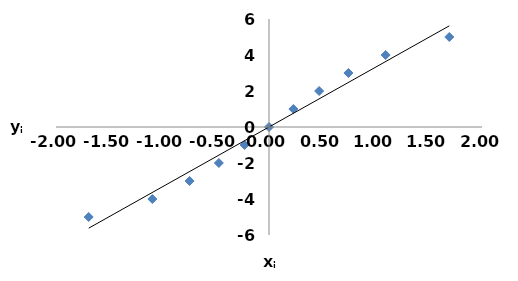
| Category | yi |
|---|---|
| -1.692884905001657 | -5 |
| -1.095418933048971 | -4 |
| -0.7456970866736052 | -3 |
| -0.4709712362120345 | -2 |
| -0.22888335892891973 | -1 |
| 0.0 | 0 |
| 0.22888335892892028 | 1 |
| 0.4709712362120345 | 2 |
| 0.7456970866736052 | 3 |
| 1.095418933048971 | 4 |
| 1.6928849050016574 | 5 |